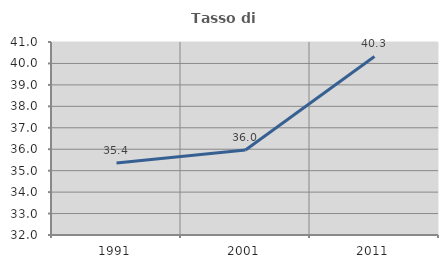
| Category | Tasso di occupazione   |
|---|---|
| 1991.0 | 35.356 |
| 2001.0 | 35.965 |
| 2011.0 | 40.326 |